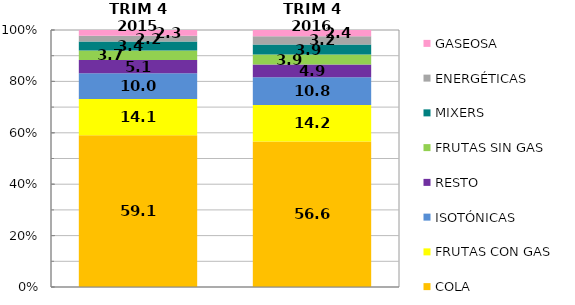
| Category | COLA | FRUTAS CON GAS | ISOTÓNICAS | RESTO | FRUTAS SIN GAS | MIXERS | ENERGÉTICAS | GASEOSA |
|---|---|---|---|---|---|---|---|---|
| TRIM 4 2015 | 59.051 | 14.126 | 10.031 | 5.14 | 3.704 | 3.442 | 2.235 | 2.271 |
| TRIM 4 2016 | 56.624 | 14.208 | 10.785 | 4.915 | 3.887 | 3.929 | 3.229 | 2.424 |